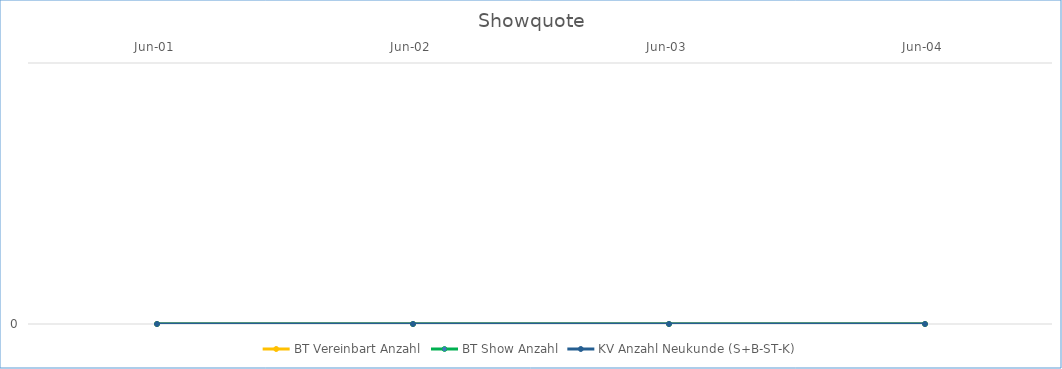
| Category | BT Vereinbart Anzahl | BT Show Anzahl | KV Anzahl Neukunde (S+B-ST-K) |
|---|---|---|---|
| 2001-06-01 | 0 | 0 | 0 |
| 2002-06-01 | 0 | 0 | 0 |
| 2003-06-01 | 0 | 0 | 0 |
| 2004-06-01 | 0 | 0 | 0 |